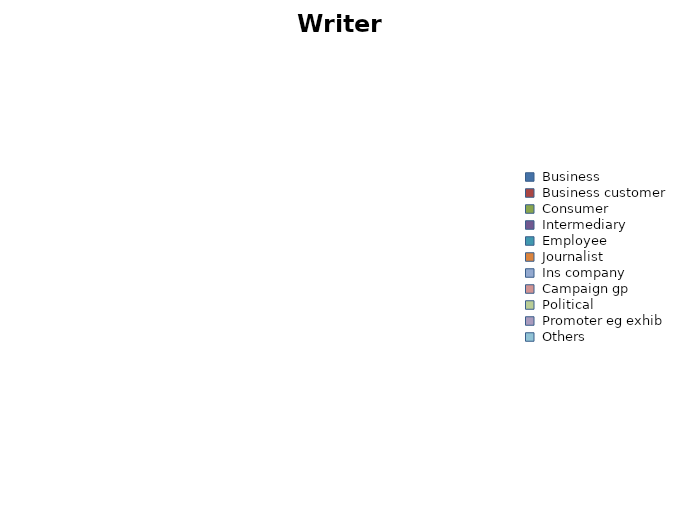
| Category | Posts |
|---|---|
| Business | 0 |
| Business customer | 0 |
| Consumer | 0 |
| Intermediary | 0 |
| Employee | 0 |
| Journalist | 0 |
| Ins company | 0 |
| Campaign gp | 0 |
| Political | 0 |
| Promoter eg exhib | 0 |
| Others | 0 |